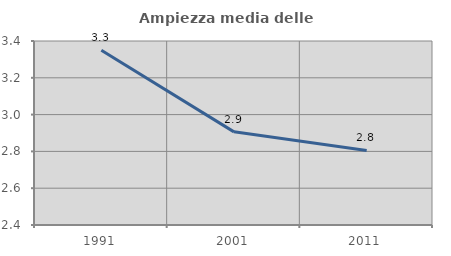
| Category | Ampiezza media delle famiglie |
|---|---|
| 1991.0 | 3.349 |
| 2001.0 | 2.906 |
| 2011.0 | 2.805 |